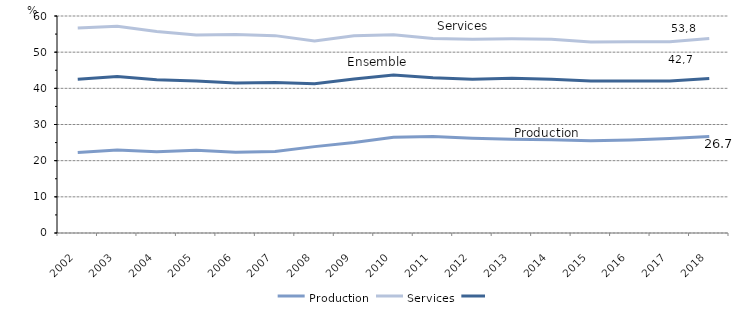
| Category | Production | Services | Ensemble |
|---|---|---|---|
| 2002.0 | 22.228 | 56.693 | 42.519 |
| 2003.0 | 22.943 | 57.171 | 43.282 |
| 2004.0 | 22.467 | 55.734 | 42.375 |
| 2005.0 | 22.871 | 54.735 | 42.047 |
| 2006.0 | 22.357 | 54.889 | 41.446 |
| 2007.0 | 22.554 | 54.571 | 41.581 |
| 2008.0 | 23.882 | 53.115 | 41.3 |
| 2009.0 | 25.031 | 54.538 | 42.606 |
| 2010.0 | 26.5 | 54.8 | 43.7 |
| 2011.0 | 26.7 | 53.8 | 42.9 |
| 2012.0 | 26.2 | 53.6 | 42.5 |
| 2013.0 | 25.9 | 53.7 | 42.8 |
| 2014.0 | 25.8 | 53.6 | 42.5 |
| 2015.0 | 25.5 | 52.8 | 42 |
| 2016.0 | 25.7 | 52.9 | 42 |
| 2017.0 | 26.1 | 52.9 | 42 |
| 2018.0 | 26.7 | 53.8 | 42.7 |